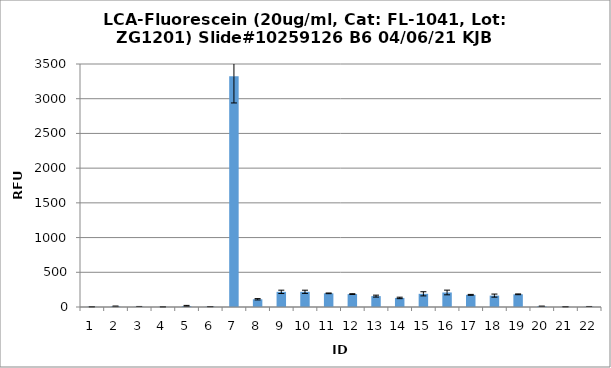
| Category | Series 0 |
|---|---|
| 0 | 3 |
| 1 | 9.75 |
| 2 | 2.75 |
| 3 | 2 |
| 4 | 14.75 |
| 5 | 5.25 |
| 6 | 3322.25 |
| 7 | 111 |
| 8 | 218.25 |
| 9 | 219 |
| 10 | 196.75 |
| 11 | 186 |
| 12 | 156.75 |
| 13 | 130.75 |
| 14 | 189.75 |
| 15 | 209.25 |
| 16 | 175 |
| 17 | 164 |
| 18 | 182.75 |
| 19 | 10.5 |
| 20 | 3.75 |
| 21 | 3.5 |